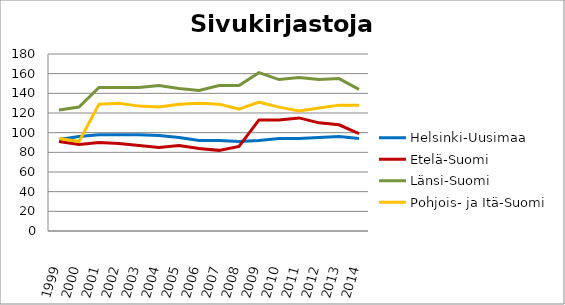
| Category | Helsinki-Uusimaa | Etelä-Suomi | Länsi-Suomi | Pohjois- ja Itä-Suomi |
|---|---|---|---|---|
| 1999.0 | 93 | 91 | 123 | 94 |
| 2000.0 | 96 | 88 | 126 | 91 |
| 2001.0 | 98 | 90 | 146 | 129 |
| 2002.0 | 98 | 89 | 146 | 130 |
| 2003.0 | 98 | 87 | 146 | 127 |
| 2004.0 | 97 | 85 | 148 | 126 |
| 2005.0 | 95 | 87 | 145 | 129 |
| 2006.0 | 92 | 84 | 143 | 130 |
| 2007.0 | 92 | 82 | 148 | 129 |
| 2008.0 | 91 | 86 | 148 | 124 |
| 2009.0 | 92 | 113 | 161 | 131 |
| 2010.0 | 94 | 113 | 154 | 126 |
| 2011.0 | 94 | 115 | 156 | 122 |
| 2012.0 | 95 | 110 | 154 | 125 |
| 2013.0 | 96 | 108 | 155 | 128 |
| 2014.0 | 94 | 99 | 144 | 128 |